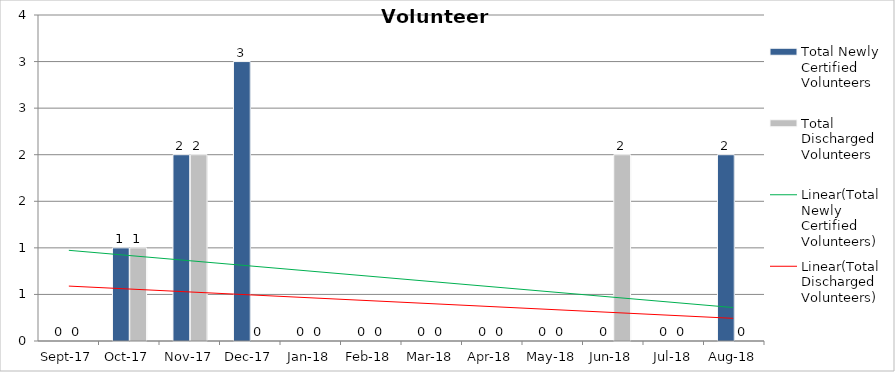
| Category | Total Newly Certified Volunteers | Total Discharged Volunteers |
|---|---|---|
| 2017-09-01 | 0 | 0 |
| 2017-10-01 | 1 | 1 |
| 2017-11-01 | 2 | 2 |
| 2017-12-01 | 3 | 0 |
| 2018-01-01 | 0 | 0 |
| 2018-02-01 | 0 | 0 |
| 2018-03-01 | 0 | 0 |
| 2018-04-01 | 0 | 0 |
| 2018-05-01 | 0 | 0 |
| 2018-06-01 | 0 | 2 |
| 2018-07-01 | 0 | 0 |
| 2018-08-01 | 2 | 0 |